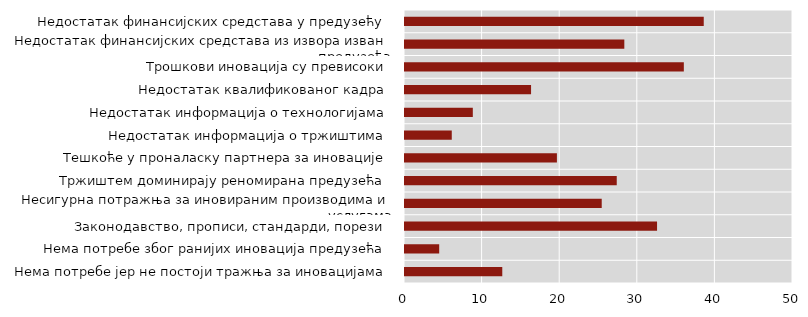
| Category | Series 2 |
|---|---|
| Нема потребе јер не постоји тражња за иновацијама | 12.536 |
| Нема потребе због ранијих иновација предузећа | 4.407 |
| Законодавство, прописи, стандарди, порези | 32.481 |
| Несигурна потражња за иновираним производима и услугама | 25.351 |
| Тржиштем доминирају реномирана предузећа | 27.287 |
| Тешкоће у проналаску партнера за иновације | 19.575 |
| Недостатак информација о тржиштима | 6.027 |
| Недостатак информација о технологијама | 8.739 |
| Недостатак квалификованог кадра | 16.245 |
| Трошкови иновација су превисоки | 35.932 |
| Недостатак финансијских средстава из извора изван предузећа | 28.263 |
| Недостатак финансијских средстава у предузећу | 38.498 |